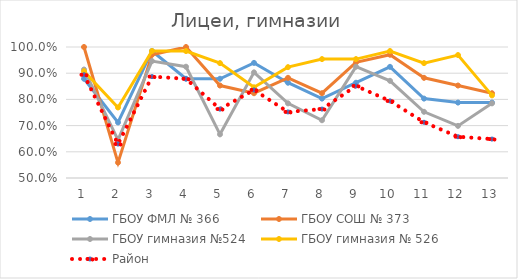
| Category | ГБОУ ФМЛ № 366 | ГБОУ СОШ № 373 | ГБОУ гимназия №524 | ГБОУ гимназия № 526 | Район |
|---|---|---|---|---|---|
| 0 | 0.879 | 1 | 0.914 | 0.908 | 0.894 |
| 1 | 0.712 | 0.559 | 0.645 | 0.769 | 0.63 |
| 2 | 0.985 | 0.971 | 0.946 | 0.985 | 0.887 |
| 3 | 0.879 | 1 | 0.925 | 0.985 | 0.879 |
| 4 | 0.879 | 0.853 | 0.667 | 0.938 | 0.763 |
| 5 | 0.939 | 0.824 | 0.903 | 0.846 | 0.836 |
| 6 | 0.864 | 0.882 | 0.785 | 0.923 | 0.752 |
| 7 | 0.803 | 0.824 | 0.72 | 0.954 | 0.763 |
| 8 | 0.864 | 0.941 | 0.925 | 0.954 | 0.851 |
| 9 | 0.924 | 0.971 | 0.871 | 0.985 | 0.794 |
| 10 | 0.803 | 0.882 | 0.753 | 0.938 | 0.713 |
| 11 | 0.788 | 0.853 | 0.699 | 0.969 | 0.658 |
| 12 | 0.788 | 0.824 | 0.785 | 0.815 | 0.649 |